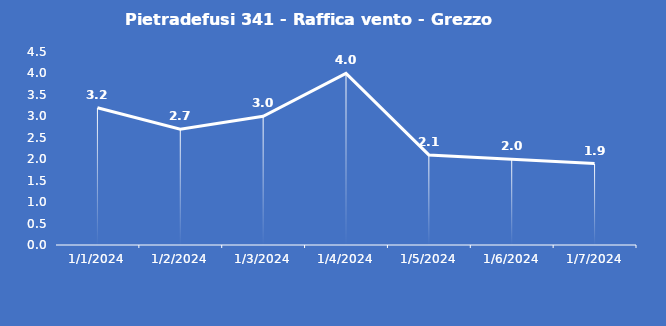
| Category | Pietradefusi 341 - Raffica vento - Grezzo (m/s) |
|---|---|
| 1/1/24 | 3.2 |
| 1/2/24 | 2.7 |
| 1/3/24 | 3 |
| 1/4/24 | 4 |
| 1/5/24 | 2.1 |
| 1/6/24 | 2 |
| 1/7/24 | 1.9 |